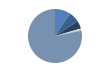
| Category | Series 0 |
|---|---|
| ARRASTRE | 89 |
| CERCO | 62 |
| PALANGRE | 45 |
| REDES DE ENMALLE | 7 |
| ARTES FIJAS | 6 |
| ARTES MENORES | 746 |